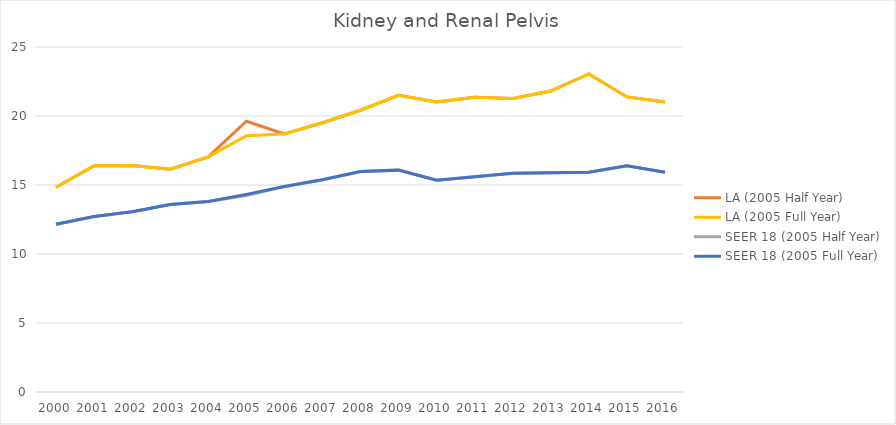
| Category | LA (2005 Half Year) | LA (2005 Full Year) | SEER 18 (2005 Half Year) | SEER 18 (2005 Full Year) |
|---|---|---|---|---|
| 2000.0 | 14.84 | 14.84 | 12.157 | 12.157 |
| 2001.0 | 16.394 | 16.394 | 12.719 | 12.719 |
| 2002.0 | 16.421 | 16.421 | 13.061 | 13.061 |
| 2003.0 | 16.149 | 16.149 | 13.583 | 13.583 |
| 2004.0 | 17.035 | 17.035 | 13.809 | 13.809 |
| 2005.0 | 19.622 | 18.563 | 14.234 | 14.32 |
| 2006.0 | 18.702 | 18.702 | 14.89 | 14.89 |
| 2007.0 | 19.512 | 19.512 | 15.383 | 15.383 |
| 2008.0 | 20.417 | 20.417 | 15.974 | 15.974 |
| 2009.0 | 21.5 | 21.5 | 16.077 | 16.077 |
| 2010.0 | 21.008 | 21.008 | 15.352 | 15.352 |
| 2011.0 | 21.361 | 21.361 | 15.603 | 15.603 |
| 2012.0 | 21.267 | 21.267 | 15.844 | 15.844 |
| 2013.0 | 21.809 | 21.809 | 15.896 | 15.896 |
| 2014.0 | 23.049 | 23.049 | 15.924 | 15.924 |
| 2015.0 | 21.383 | 21.383 | 16.398 | 16.398 |
| 2016.0 | 21.021 | 21.021 | 15.93 | 15.93 |